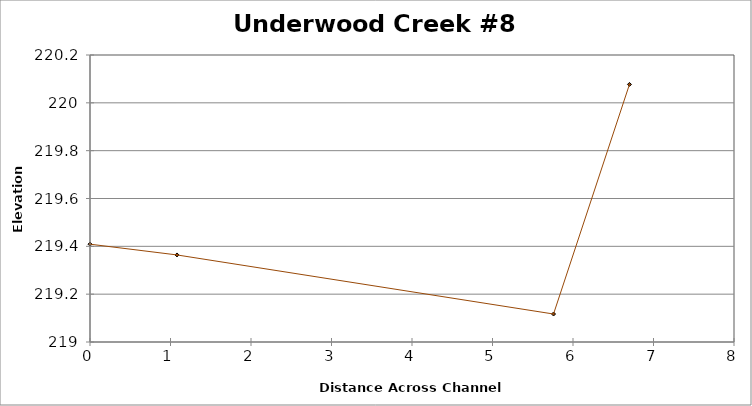
| Category | Series 0 |
|---|---|
| 0.0 | 219.409 |
| 1.0806155649648541 | 219.364 |
| 5.758141453516981 | 219.117 |
| 6.701328600024812 | 220.077 |